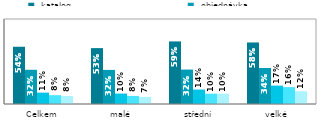
| Category |  katalog |  objednávka |  konfigurace produktu |  sledování zakázky |  platba |
|---|---|---|---|---|---|
| Celkem | 0.539 | 0.322 | 0.107 | 0.083 | 0.075 |
| malé | 0.526 | 0.321 | 0.098 | 0.076 | 0.067 |
| střední | 0.589 | 0.324 | 0.136 | 0.097 | 0.097 |
| velké | 0.579 | 0.339 | 0.173 | 0.159 | 0.12 |